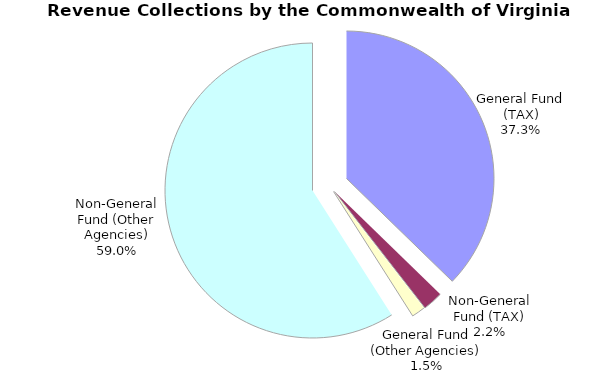
| Category | Series 0 |
|---|---|
| General Fund (TAX) | 0.373 |
| Non-General Fund (TAX) | 0.022 |
| General Fund (Other Agencies) | 0.015 |
| Non-General Fund (Other Agencies) | 0.59 |